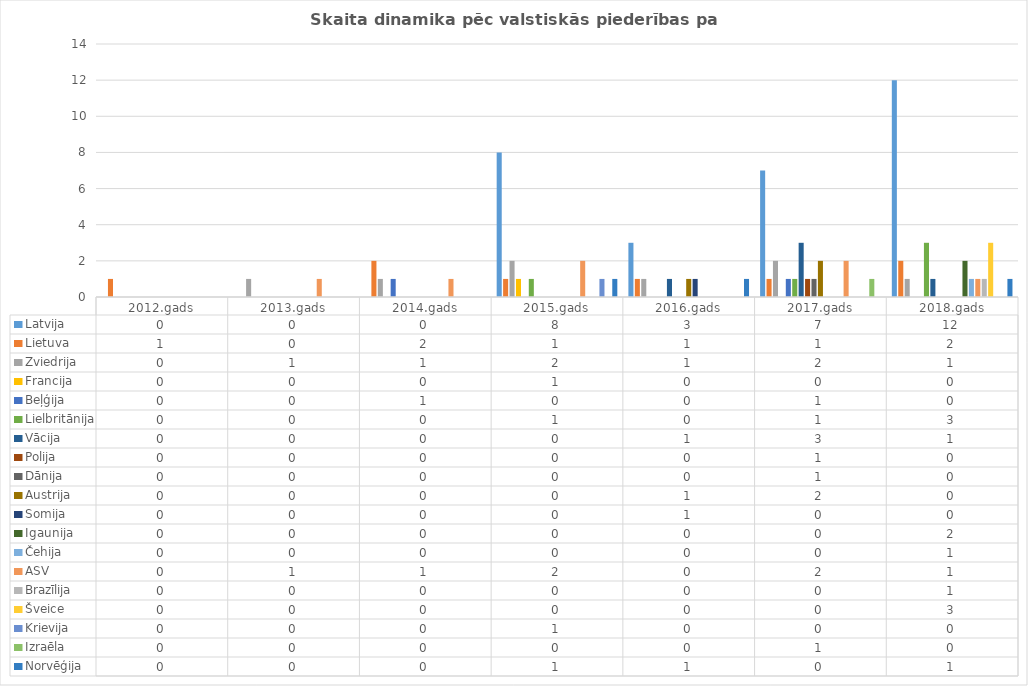
| Category | Latvija | Lietuva | Zviedrija | Francija | Beļģija | Lielbritānija | Vācija | Polija | Dānija | Austrija | Somija | Igaunija | Čehija | ASV | Brazīlija | Šveice | Krievija | Izraēla | Norvēģija |
|---|---|---|---|---|---|---|---|---|---|---|---|---|---|---|---|---|---|---|---|
| 2012.gads | 0 | 1 | 0 | 0 | 0 | 0 | 0 | 0 | 0 | 0 | 0 | 0 | 0 | 0 | 0 | 0 | 0 | 0 | 0 |
| 2013.gads | 0 | 0 | 1 | 0 | 0 | 0 | 0 | 0 | 0 | 0 | 0 | 0 | 0 | 1 | 0 | 0 | 0 | 0 | 0 |
| 2014.gads | 0 | 2 | 1 | 0 | 1 | 0 | 0 | 0 | 0 | 0 | 0 | 0 | 0 | 1 | 0 | 0 | 0 | 0 | 0 |
| 2015.gads | 8 | 1 | 2 | 1 | 0 | 1 | 0 | 0 | 0 | 0 | 0 | 0 | 0 | 2 | 0 | 0 | 1 | 0 | 1 |
| 2016.gads | 3 | 1 | 1 | 0 | 0 | 0 | 1 | 0 | 0 | 1 | 1 | 0 | 0 | 0 | 0 | 0 | 0 | 0 | 1 |
| 2017.gads | 7 | 1 | 2 | 0 | 1 | 1 | 3 | 1 | 1 | 2 | 0 | 0 | 0 | 2 | 0 | 0 | 0 | 1 | 0 |
| 2018.gads | 12 | 2 | 1 | 0 | 0 | 3 | 1 | 0 | 0 | 0 | 0 | 2 | 1 | 1 | 1 | 3 | 0 | 0 | 1 |